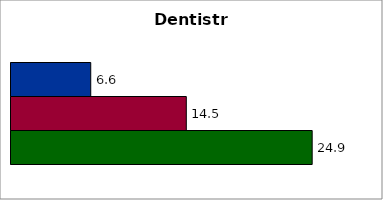
| Category | 50 states and D.C. | SREB states | State |
|---|---|---|---|
| 0 | 6.59 | 14.488 | 24.891 |